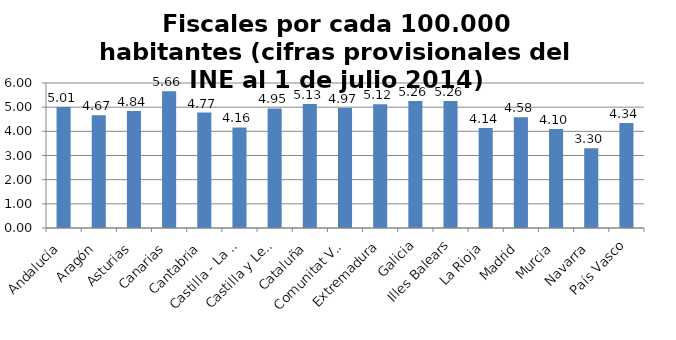
| Category | Fiscales por cada 100.000 habitantes |
|---|---|
| Andalucía | 5.011 |
| Aragón | 4.666 |
| Asturias | 4.837 |
| Canarias | 5.659 |
| Cantabria | 4.775 |
| Castilla - La Mancha | 4.16 |
| Castilla y León | 4.95 |
| Cataluña | 5.135 |
| Comunitat Valenciana | 4.97 |
| Extremadura | 5.121 |
| Galicia | 5.257 |
| Illes Balears | 5.26 |
| La Rioja | 4.139 |
| Madrid | 4.579 |
| Murcia | 4.099 |
| Navarra | 3.302 |
| País Vasco | 4.34 |